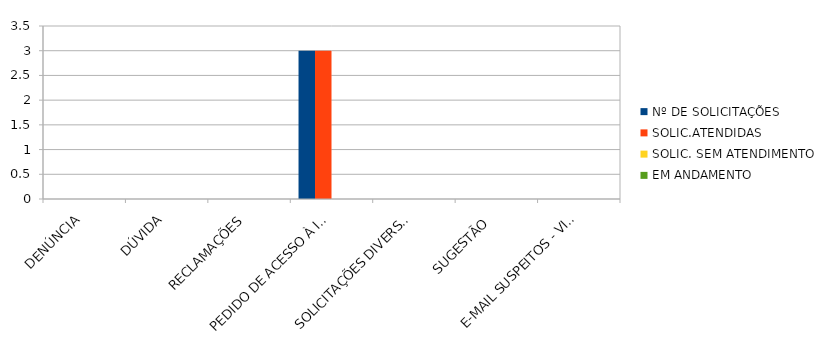
| Category | Nº DE SOLICITAÇÕES | SOLIC.ATENDIDAS | SOLIC. SEM ATENDIMENTO | EM ANDAMENTO |
|---|---|---|---|---|
| DENÚNCIA | 0 | 0 | 0 | 0 |
| DÚVIDA | 0 | 0 | 0 | 0 |
| RECLAMAÇÕES | 0 | 0 | 0 | 0 |
| PEDIDO DE ACESSO À INFORMAÇÃO | 3 | 3 | 0 | 0 |
| SOLICITAÇÕES DIVERSAS | 0 | 0 | 0 | 0 |
| SUGESTÃO  | 0 | 0 | 0 | 0 |
| E-MAIL SUSPEITOS - VIRÚS | 0 | 0 | 0 | 0 |